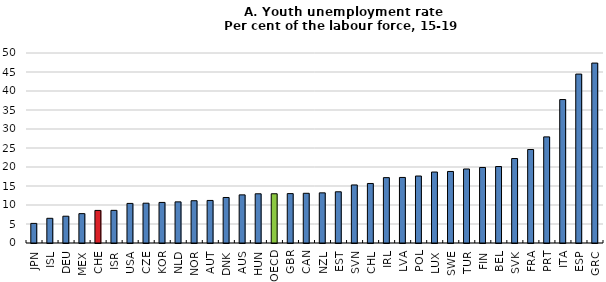
| Category | 2016 |
|---|---|
| JPN | 5.158 |
| ISL | 6.5 |
| DEU | 7.05 |
| MEX | 7.728 |
| CHE | 8.575 |
| ISR | 8.592 |
| USA | 10.417 |
| CZE | 10.475 |
| KOR | 10.676 |
| NLD | 10.825 |
| NOR | 11.125 |
| AUT | 11.2 |
| DNK | 11.975 |
| AUS | 12.665 |
| HUN | 12.95 |
| OECD | 12.959 |
| GBR | 13 |
| CAN | 13.083 |
| NZL | 13.199 |
| EST | 13.475 |
| SVN | 15.275 |
| CHL | 15.664 |
| IRL | 17.2 |
| LVA | 17.25 |
| POL | 17.625 |
| LUX | 18.675 |
| SWE | 18.825 |
| TUR | 19.475 |
| FIN | 19.875 |
| BEL | 20.125 |
| SVK | 22.225 |
| FRA | 24.6 |
| PRT | 27.925 |
| ITA | 37.75 |
| ESP | 44.45 |
| GRC | 47.35 |